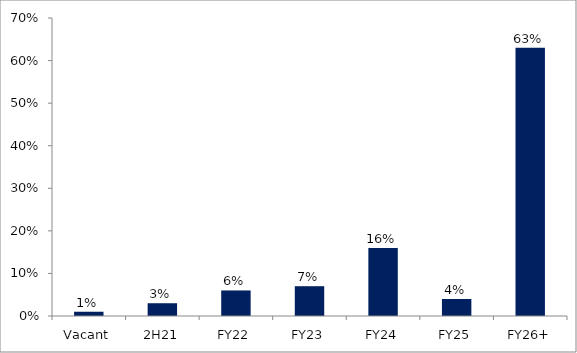
| Category | Series 0 |
|---|---|
| Vacant | 0.01 |
| 2H21 | 0.03 |
| FY22 | 0.06 |
| FY23 | 0.07 |
| FY24 | 0.16 |
| FY25 | 0.04 |
| FY26+ | 0.63 |